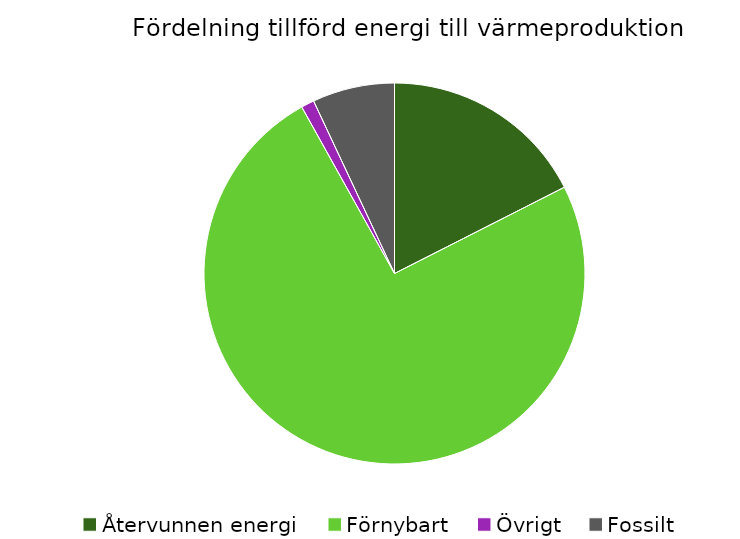
| Category | Fördelning värmeproduktion |
|---|---|
| Återvunnen energi | 0.175 |
| Förnybart | 0.744 |
| Övrigt | 0.011 |
| Fossilt | 0.07 |